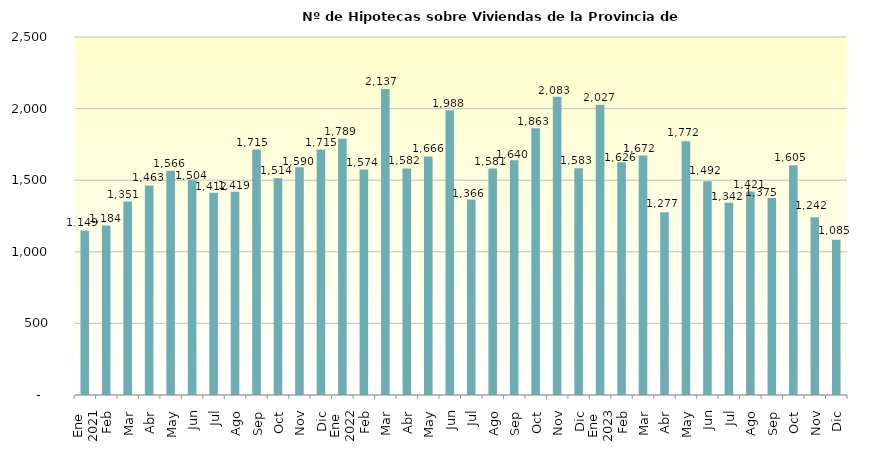
| Category | Series 0 |
|---|---|
| 0 | 1149 |
| 1 | 1184 |
| 2 | 1351 |
| 3 | 1463 |
| 4 | 1566 |
| 5 | 1504 |
| 6 | 1412 |
| 7 | 1419 |
| 8 | 1715 |
| 9 | 1514 |
| 10 | 1590 |
| 11 | 1715 |
| 12 | 1789 |
| 13 | 1574 |
| 14 | 2137 |
| 15 | 1582 |
| 16 | 1666 |
| 17 | 1988 |
| 18 | 1366 |
| 19 | 1581 |
| 20 | 1640 |
| 21 | 1863 |
| 22 | 2083 |
| 23 | 1583 |
| 24 | 2027 |
| 25 | 1626 |
| 26 | 1672 |
| 27 | 1277 |
| 28 | 1772 |
| 29 | 1492 |
| 30 | 1342 |
| 31 | 1421 |
| 32 | 1375 |
| 33 | 1605 |
| 34 | 1242 |
| 35 | 1085 |